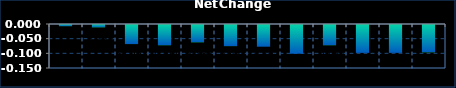
| Category | Series 0 |
|---|---|
| 0 | -0.004 |
| 1 | -0.008 |
| 2 | -0.065 |
| 3 | -0.069 |
| 4 | -0.059 |
| 5 | -0.072 |
| 6 | -0.074 |
| 7 | -0.098 |
| 8 | -0.069 |
| 9 | -0.095 |
| 10 | -0.095 |
| 11 | -0.093 |